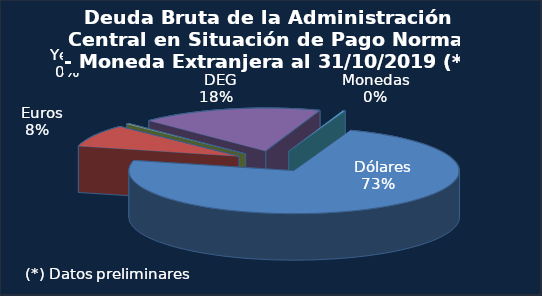
| Category | Series 0 |
|---|---|
|   Dólares | 181144.2 |
|   Euros | 20677.9 |
|   Yenes | 769.4 |
|   DEG | 44032.8 |
|   Otras Monedas | 572.2 |